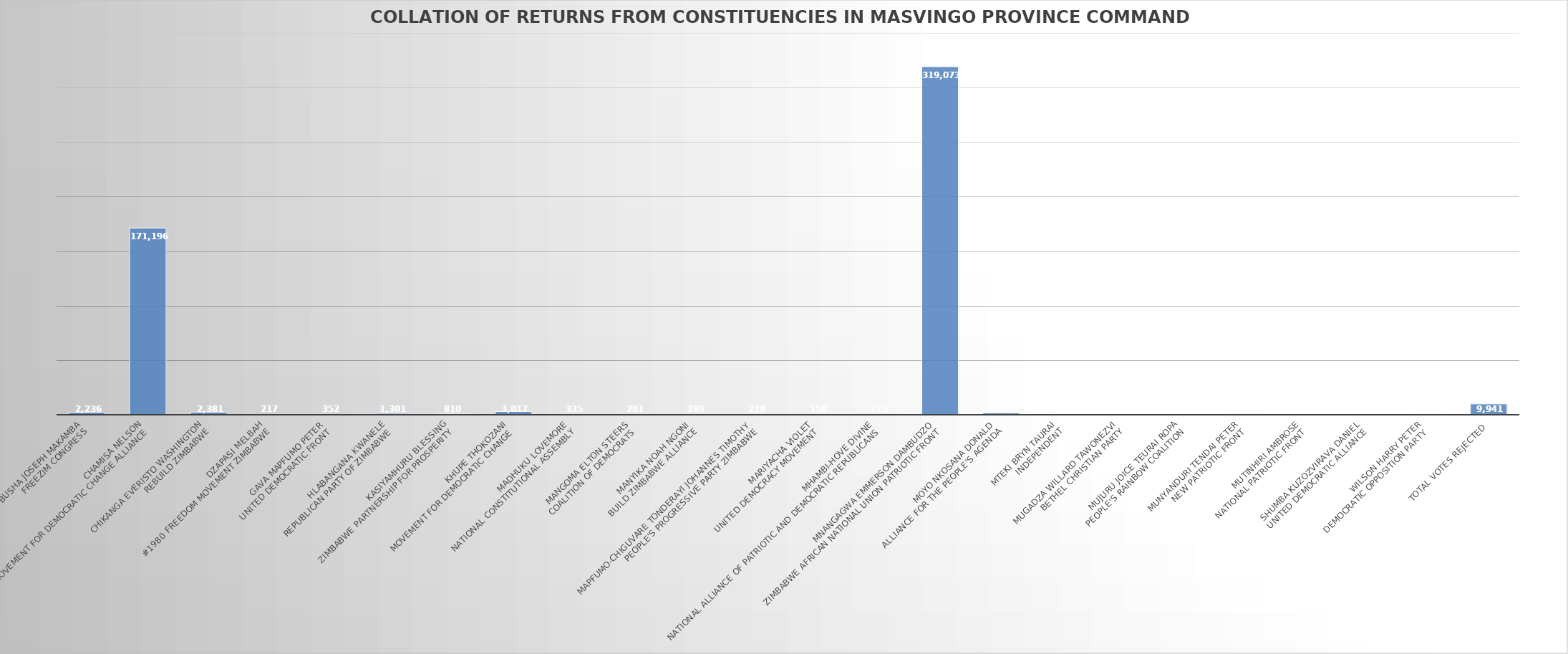
| Category | Series 0 |
|---|---|
| Busha Joseph Makamba
FreeZim Congress | 2236 |
| Chamisa Nelson
Movement for Democratic Change Alliance | 171196 |
| Chikanga Everisto Washington
Rebuild Zimbabwe | 2381 |
| Dzapasi Melbah
#1980 Freedom Movement Zimbabwe | 217 |
| Gava Mapfumo Peter
United Democratic Front | 352 |
| Hlabangana Kwanele
Republican Party of Zimbabwe | 1301 |
| Kasiyamhuru Blessing
Zimbabwe Partnership for Prosperity | 810 |
| Khupe Thokozani
Movement for Democratic Change | 3017 |
| Madhuku Lovemore
National Constitutional Assembly | 335 |
| Mangoma Elton Steers
Coalition of Democrats | 281 |
| Manyika Noah Ngoni
Build Zimbabwe Alliance | 289 |
| Mapfumo-Chiguvare Tonderayi Johannes Timothy
People's Progressive party Zimbabwe | 218 |
| Mariyacha Violet
United Democracy Movement | 158 |
| Mhambi-Hove Divine
national Alliance of Patriotic and Democratic Republicans | 775 |
| Mnangagwa Emmerson Dambudzo
Zimbabwe African National Union Patriotic Front | 319073 |
| Moyo Nkosana Donald
Alliance for the People's Agenda | 1708 |
| Mteki Bryn Taurai
Independent | 411 |
| Mugadza Willard Tawonezvi
Bethel Christian Party | 627 |
| Mujuru Joice Teurai Ropa
People's Rainbow Coalition | 979 |
| Munyanduri Tendai Peter
New Patriotic Front | 798 |
| Mutinhiri Ambrose
National Patriotic Front | 600 |
| Shumba Kuzozvirava Daniel
United Democratic Alliance | 534 |
| Wilson Harry Peter
Democratic Opposition Party | 857 |
| Total Votes Rejected | 9941 |